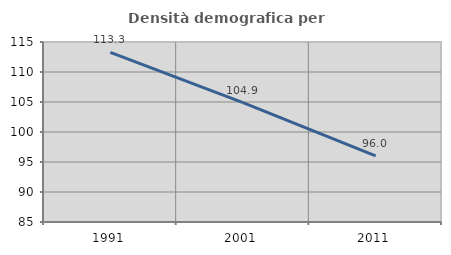
| Category | Densità demografica |
|---|---|
| 1991.0 | 113.285 |
| 2001.0 | 104.895 |
| 2011.0 | 96.006 |